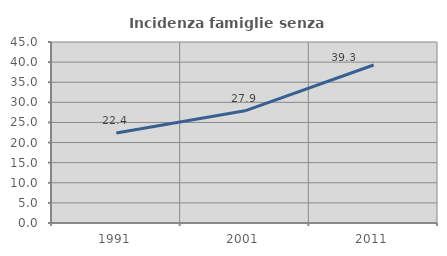
| Category | Incidenza famiglie senza nuclei |
|---|---|
| 1991.0 | 22.368 |
| 2001.0 | 27.891 |
| 2011.0 | 39.286 |